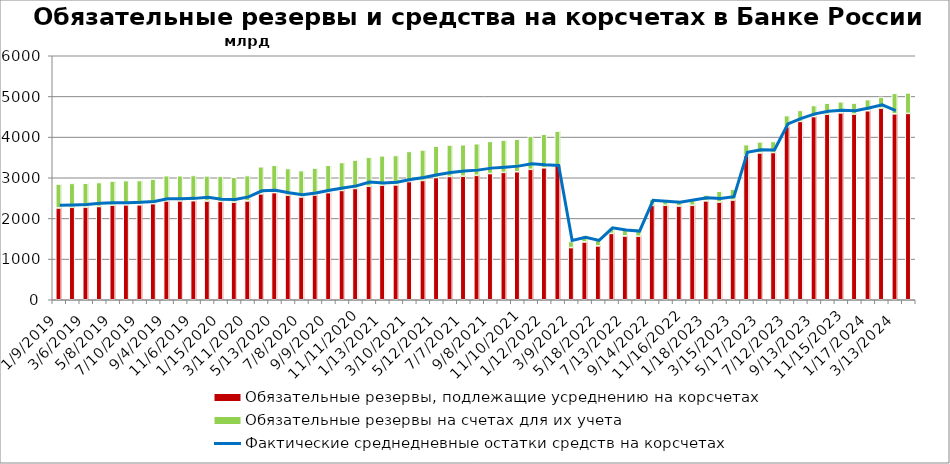
| Category | Обязательные резервы, подлежащие усреднению на корсчетах | Обязательные резервы на счетах для их учета |
|---|---|---|
| 1/9/19 | 2258 | 586.3 |
| 2/6/19 | 2272.8 | 588.4 |
| 3/6/19 | 2278.9 | 587.2 |
| 4/10/19 | 2293.5 | 588.9 |
| 5/8/19 | 2324.4 | 593.9 |
| 6/5/19 | 2333.9 | 595.9 |
| 7/10/19 | 2334.8 | 596.7 |
| 8/7/19 | 2362.6 | 603.8 |
| 9/4/19 | 2429.5 | 620.1 |
| 10/9/19 | 2430.2 | 618.9 |
| 11/6/19 | 2436.2 | 619.4 |
| 12/11/19 | 2427.8 | 617.4 |
| 1/15/20 | 2418.4 | 617.6 |
| 2/12/20 | 2398.3 | 612.7 |
| 3/11/20 | 2430.8 | 622 |
| 4/8/20 | 2604.9 | 664.8 |
| 5/13/20 | 2634.6 | 671.3 |
| 6/10/20 | 2569.5 | 656.3 |
| 7/8/20 | 2528.5 | 646.7 |
| 8/5/20 | 2577.9 | 659.2 |
| 9/9/20 | 2633.9 | 673.2 |
| 10/7/20 | 2688.3 | 686.2 |
| 11/11/20 | 2736.7 | 699 |
| 12/9/20 | 2790.7 | 713.6 |
| 1/13/21 | 2818.1 | 720.7 |
| 2/10/21 | 2825 | 722 |
| 3/10/21 | 2906.3 | 740.9 |
| 4/7/21 | 2934.1 | 748.8 |
| 5/12/21 | 3005.8 | 771.8 |
| 6/9/21 | 3032 | 772.4 |
| 7/7/21 | 3038.5 | 773.5 |
| 8/11/21 | 3058.6 | 777.9 |
| 9/8/21 | 3104.1 | 788.5 |
| 10/13/21 | 3131.5 | 794.4 |
| 11/10/21 | 3148.9 | 799.9 |
| 12/8/21 | 3207.4 | 815.3 |
| 1/12/22 | 3244.6 | 825.4 |
| 2/9/22 | 3304.6 | 843.3 |
| 3/9/22 | 1283.1 | 150 |
| 4/13/22 | 1420.9 | 162.1 |
| 5/18/22 | 1325.5 | 145.9 |
| 6/15/22 | 1631.2 | 145.9 |
| 7/13/22 | 1568.7 | 146 |
| 8/10/22 | 1562.1 | 146 |
| 9/14/22 | 2320.5 | 145.9 |
| 10/12/22 | 2323.3 | 145.9 |
| 11/16/22 | 2305.2 | 145.9 |
| 12/14/22 | 2322.1 | 145.9 |
| 1/18/23 | 2431.6 | 145.9 |
| 2/15/23 | 2402.1 | 265.4 |
| 3/15/23 | 2453.2 | 265.4 |
| 4/12/23 | 3547.9 | 265.3 |
| 5/17/23 | 3611.6 | 271.3 |
| 6/14/23 | 3621.4 | 271.3 |
| 7/12/23 | 4255.8 | 271.3 |
| 8/9/23 | 4385.3 | 271.7 |
| 9/13/23 | 4503.9 | 271.7 |
| 10/11/23 | 4562.5 | 271.7 |
| 11/15/23 | 4595.6 | 271.7 |
| 12/13/23 | 4564.6 | 271.7 |
| 1/17/24 | 4647.3 | 273.2 |
| 2/14/24 | 4712.3 | 273.1 |
| 3/13/24 | 4571.8 | 504.2 |
| 4/10/24 | 4581.9 | 504.2 |